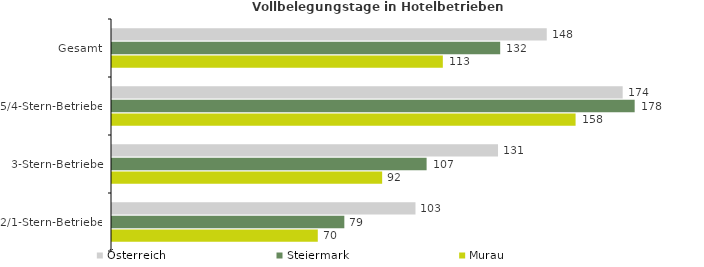
| Category | Österreich | Steiermark | Murau |
|---|---|---|---|
| Gesamt | 147.876 | 132.038 | 112.526 |
| 5/4-Stern-Betriebe | 173.697 | 177.779 | 157.68 |
| 3-Stern-Betriebe | 131.294 | 107.011 | 91.889 |
| 2/1-Stern-Betriebe | 103.222 | 79.024 | 69.994 |